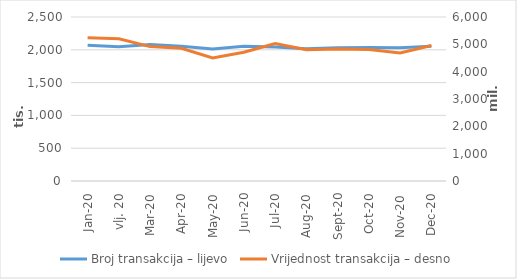
| Category | Broj transakcija – lijevo |
|---|---|
| sij.20 | 2069079 |
| vlj. 20 | 2045899 |
| ožu.20 | 2080180 |
| tra.20 | 2053561 |
| svi.20 | 2011524 |
| lip.20 | 2054680 |
| srp.20 | 2042820 |
| kol.20 | 2016083 |
| ruj.20 | 2030011 |
| lis.20 | 2035552 |
| stu.20 | 2031822 |
| pro.20 | 2052860 |